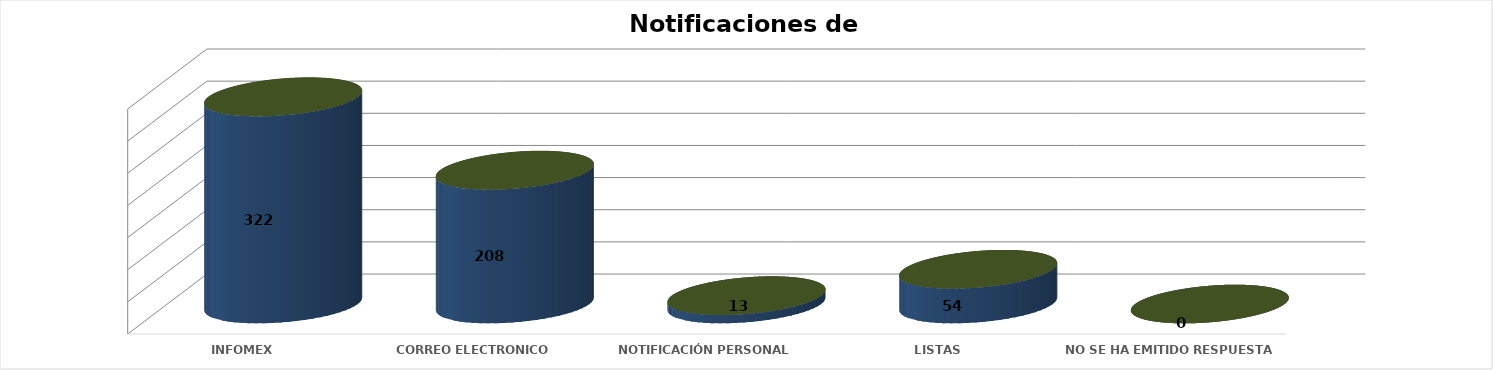
| Category | Series 0 | Series 1 | Series 2 | Series 3 | Series 4 |
|---|---|---|---|---|---|
| INFOMEX |  |  |  | 322 | 0.539 |
| CORREO ELECTRONICO |  |  |  | 208 | 0.348 |
| NOTIFICACIÓN PERSONAL |  |  |  | 13 | 0.022 |
| LISTAS |  |  |  | 54 | 0.09 |
|  NO SE HA EMITIDO RESPUESTA |  |  |  | 0 | 0 |